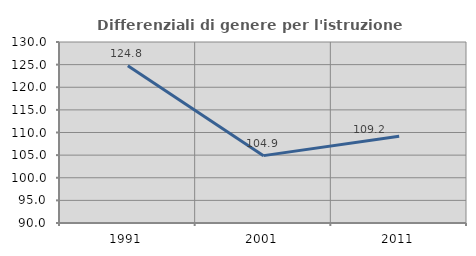
| Category | Differenziali di genere per l'istruzione superiore |
|---|---|
| 1991.0 | 124.767 |
| 2001.0 | 104.888 |
| 2011.0 | 109.174 |